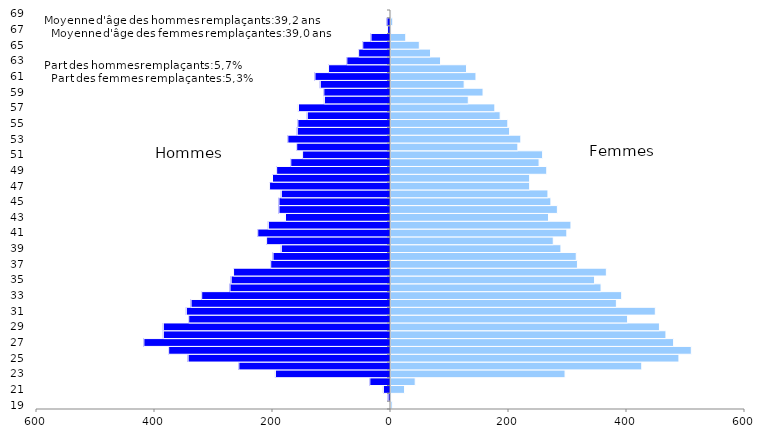
| Category | Hommes | Femmes |
|---|---|---|
| 19.0 | 0 | 2 |
| 20.0 | -4 | 1 |
| 21.0 | -12 | 23 |
| 22.0 | -35 | 41 |
| 23.0 | -195 | 295 |
| 24.0 | -257 | 425 |
| 25.0 | -343 | 488 |
| 26.0 | -376 | 509 |
| 27.0 | -418 | 479 |
| 28.0 | -385 | 466 |
| 29.0 | -385 | 455 |
| 30.0 | -342 | 401 |
| 31.0 | -346 | 448 |
| 32.0 | -338 | 382 |
| 33.0 | -320 | 391 |
| 34.0 | -272 | 356 |
| 35.0 | -270 | 345 |
| 36.0 | -266 | 365 |
| 37.0 | -203 | 316 |
| 38.0 | -199 | 314 |
| 39.0 | -185 | 288 |
| 40.0 | -210 | 275 |
| 41.0 | -225 | 298 |
| 42.0 | -207 | 305 |
| 43.0 | -178 | 267 |
| 44.0 | -189 | 282 |
| 45.0 | -189 | 271 |
| 46.0 | -185 | 266 |
| 47.0 | -205 | 235 |
| 48.0 | -200 | 235 |
| 49.0 | -193 | 264 |
| 50.0 | -169 | 251 |
| 51.0 | -149 | 257 |
| 52.0 | -159 | 215 |
| 53.0 | -174 | 220 |
| 54.0 | -158 | 201 |
| 55.0 | -157 | 198 |
| 56.0 | -141 | 185 |
| 57.0 | -156 | 176 |
| 58.0 | -112 | 131 |
| 59.0 | -113 | 156 |
| 60.0 | -119 | 124 |
| 61.0 | -128 | 144 |
| 62.0 | -105 | 128 |
| 63.0 | -74 | 84 |
| 64.0 | -54 | 67 |
| 65.0 | -47 | 48 |
| 66.0 | -33 | 25 |
| 67.0 | -5 | 1 |
| 68.0 | -6 | 3 |
| 69.0 | 0 | 1 |